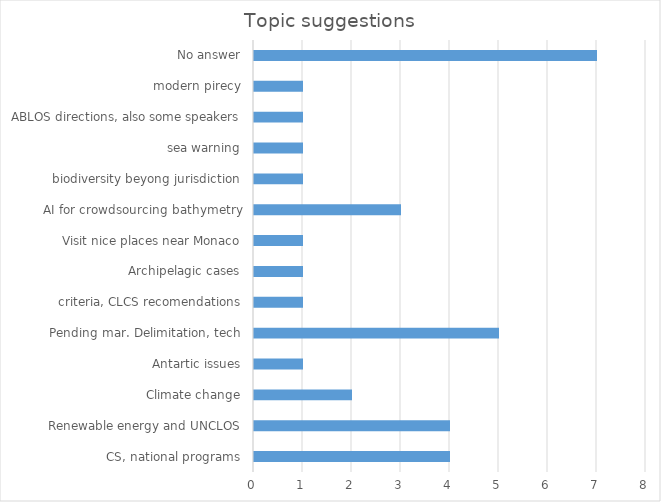
| Category | Series 0 |
|---|---|
| CS, national programs | 4 |
| Renewable energy and UNCLOS | 4 |
| Climate change | 2 |
| Antartic issues | 1 |
| Pending mar. Delimitation, tech | 5 |
| criteria, CLCS recomendations | 1 |
| Archipelagic cases | 1 |
| Visit nice places near Monaco | 1 |
| AI for crowdsourcing bathymetry | 3 |
| biodiversity beyong jurisdiction | 1 |
| sea warning | 1 |
| ABLOS directions, also some speakers | 1 |
| modern pirecy | 1 |
| No answer | 7 |